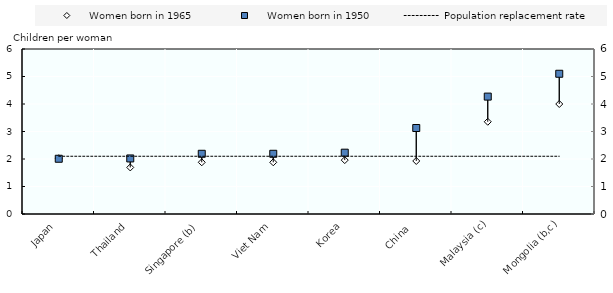
| Category | Women born in 1965 | Women born in 1950 |
|---|---|---|
| Japan | 2.028 | 2.009 |
| Thailand | 1.693 | 2.02 |
| Singapore (b) | 1.88 | 2.19 |
| Viet Nam | 1.88 | 2.19 |
| Korea | 1.96 | 2.23 |
| China  | 1.928 | 3.127 |
| Malaysia (c) | 3.354 | 4.269 |
| Mongolia (b,c) | 4 | 5.1 |